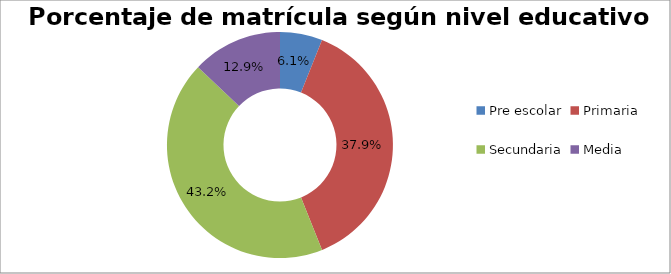
| Category | Series 0 |
|---|---|
| Pre escolar | 0.061 |
| Primaria | 0.379 |
| Secundaria | 0.432 |
| Media | 0.129 |